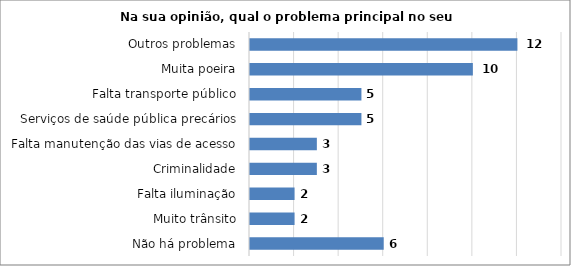
| Category | Series 0 |
|---|---|
| Não há problema | 6 |
| Muito trânsito | 2 |
| Falta iluminação | 2 |
| Criminalidade | 3 |
| Falta manutenção das vias de acesso | 3 |
| Serviços de saúde pública precários | 5 |
| Falta transporte público | 5 |
| Muita poeira | 10 |
| Outros problemas | 12 |